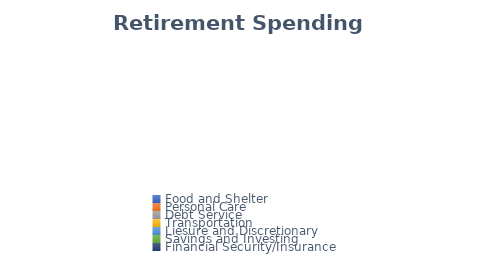
| Category | Series 0 |
|---|---|
| Food and Shelter | 0 |
| Personal Care | 0 |
| Debt Service | 0 |
| Transportation | 0 |
| Liesure and Discretionary | 0 |
| Savings and Investing | 0 |
| Financial Security/Insurance | 0 |